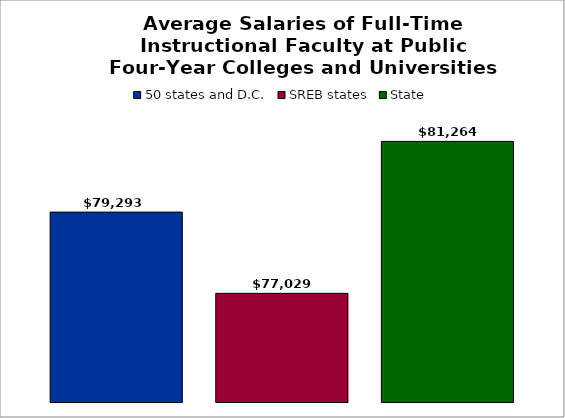
| Category | 50 states and D.C. | SREB states | State |
|---|---|---|---|
| 0 | 79293.426 | 77028.697 | 81264.435 |